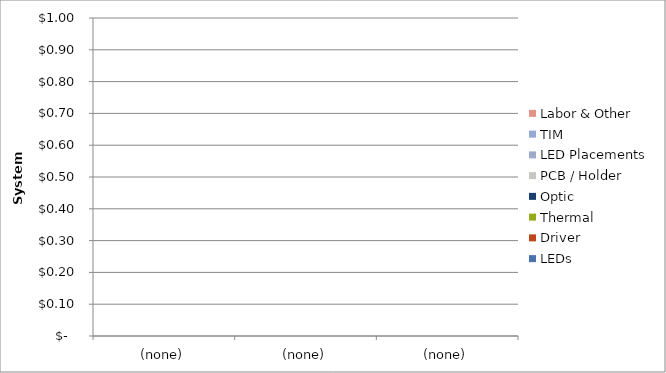
| Category | LEDs | Driver | Thermal | Optic | PCB / Holder | LED Placements | TIM | Labor & Other |
|---|---|---|---|---|---|---|---|---|
| (none) | 0 | 0 | 0 | 0 | 0 | 0 | 0 | 0 |
| (none) | 0 | 0 | 0 | 0 | 0 | 0 | 0 | 0 |
| (none) | 0 | 0 | 0 | 0 | 0 | 0 | 0 | 0 |